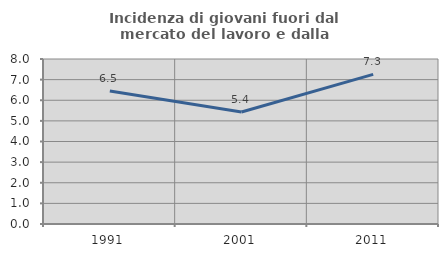
| Category | Incidenza di giovani fuori dal mercato del lavoro e dalla formazione  |
|---|---|
| 1991.0 | 6.452 |
| 2001.0 | 5.433 |
| 2011.0 | 7.256 |